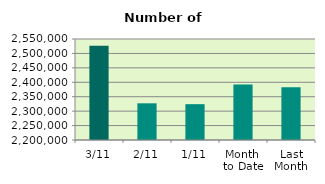
| Category | Series 0 |
|---|---|
| 3/11 | 2526856 |
| 2/11 | 2327116 |
| 1/11 | 2324192 |
| Month 
to Date | 2392721.333 |
| Last
Month | 2382963.143 |